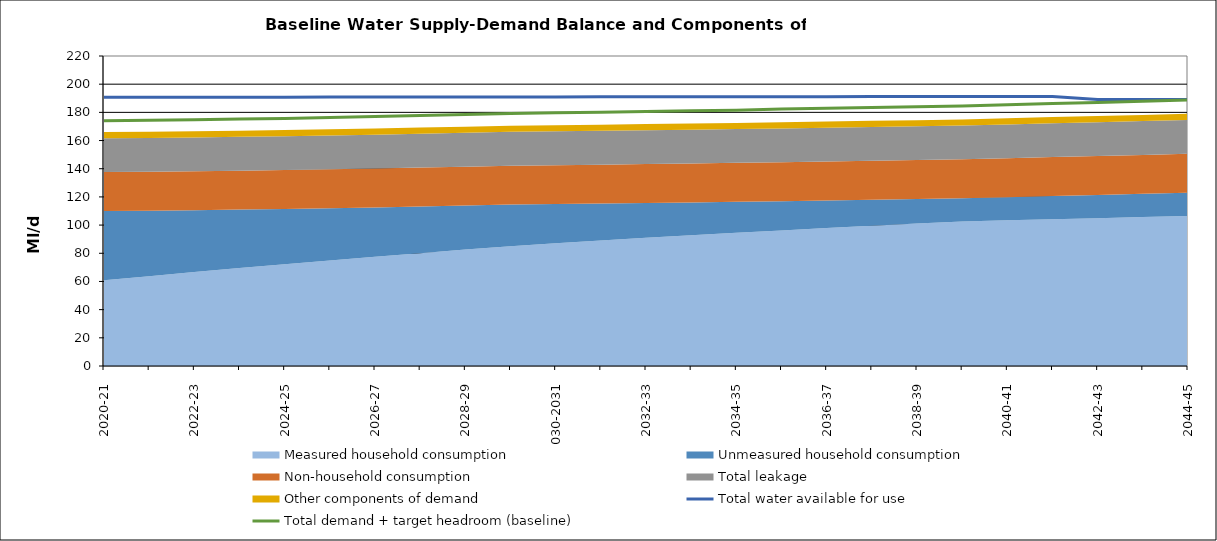
| Category | Total water available for use | Total demand + target headroom (baseline) |
|---|---|---|
| 0 | 190.669 | 174.052 |
| 1 | 190.699 | 174.429 |
| 2 | 190.729 | 174.765 |
| 3 | 190.759 | 175.265 |
| 4 | 190.789 | 175.706 |
| 5 | 190.819 | 176.398 |
| 6 | 190.849 | 176.987 |
| 7 | 190.879 | 177.715 |
| 8 | 190.909 | 178.544 |
| 9 | 190.939 | 179.261 |
| 10 | 190.969 | 179.744 |
| 11 | 190.999 | 180.133 |
| 12 | 191.029 | 180.645 |
| 13 | 191.059 | 181.216 |
| 14 | 191.089 | 181.585 |
| 15 | 191.119 | 182.317 |
| 16 | 191.149 | 182.841 |
| 17 | 191.179 | 183.387 |
| 18 | 191.209 | 183.941 |
| 19 | 191.239 | 184.521 |
| 20 | 191.269 | 185.372 |
| 21 | 191.299 | 186.212 |
| 22 | 189.079 | 187.053 |
| 23 | 189.109 | 187.884 |
| 24 | 189.149 | 188.706 |